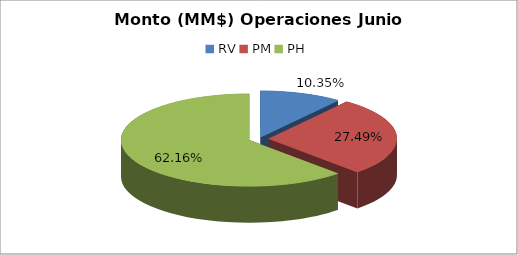
| Category | Series 0 |
|---|---|
| RV | 1271543.287 |
| PM | 3377453.657 |
| PH | 7635505.378 |